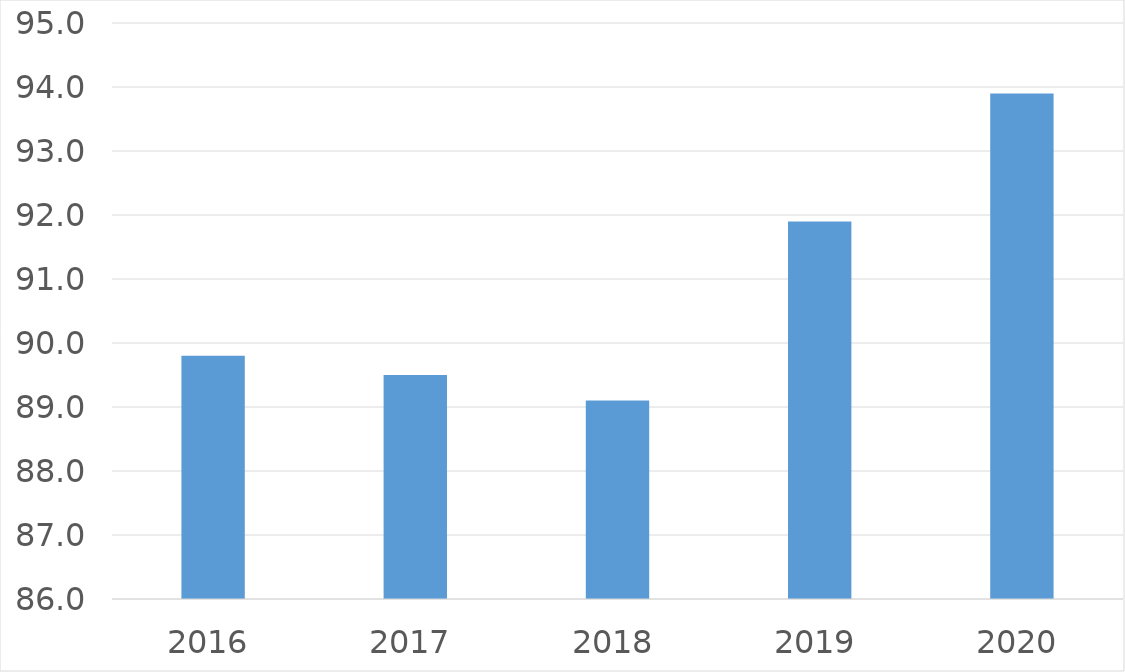
| Category | Series 0 |
|---|---|
| 2016 | 89.8 |
| 2017 | 89.5 |
| 2018 | 89.1 |
| 2019 | 91.9 |
| 2020 | 93.9 |